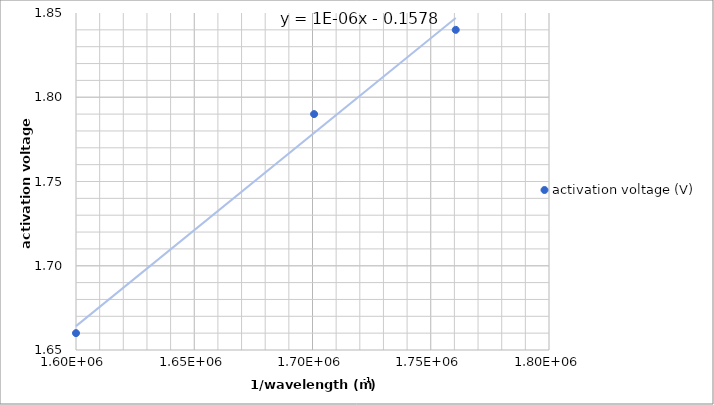
| Category | activation voltage (V) |
|---|---|
| 1599999.9999999998 | 1.66 |
| 1760563.38028169 | 1.84 |
| 1700680.2721088436 | 1.79 |